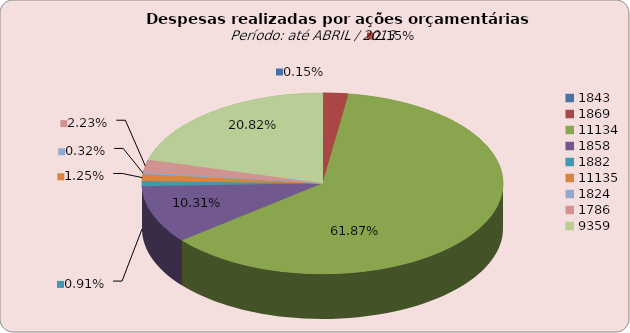
| Category | Series 1 |
|---|---|
| 1843.0 | 81117.02 |
| 1869.0 | 1194485.9 |
| 11134.0 | 34315763.05 |
| 1858.0 | 5718207.94 |
| 1882.0 | 503655.42 |
| 11135.0 | 690773.81 |
| 1824.0 | 179292.2 |
| 1786.0 | 1236278.09 |
| 9359.0 | 11546822.3 |